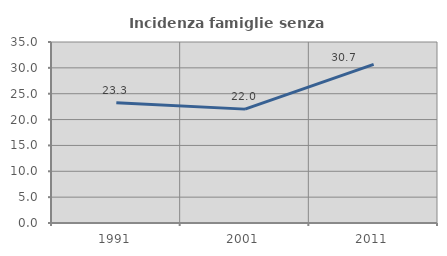
| Category | Incidenza famiglie senza nuclei |
|---|---|
| 1991.0 | 23.264 |
| 2001.0 | 22.02 |
| 2011.0 | 30.674 |